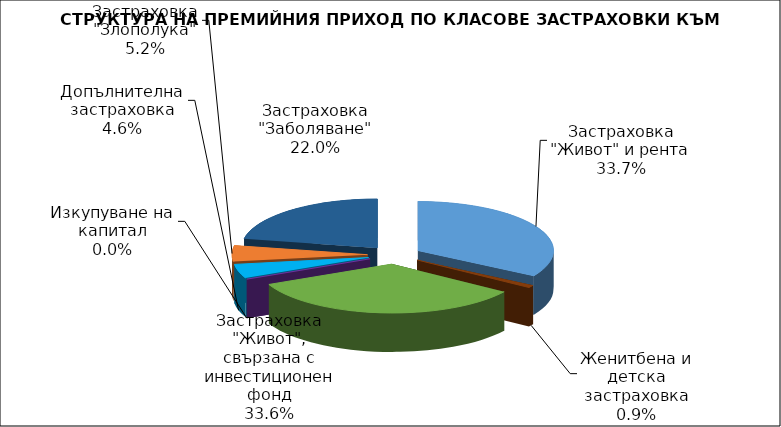
| Category | Застраховка "Живот" и рента |
|---|---|
| Застраховка "Живот" и рента | 21965824.74 |
| Женитбена и детска застраховка | 580651.999 |
| Застраховка "Живот", свързана с инвестиционен фонд | 21939625.679 |
| Изкупуване на капитал | 0 |
| Допълнителна застраховка | 3001886.026 |
| Застраховка "Злополука" | 3417940.97 |
| Застраховка "Заболяване" | 14366931.93 |